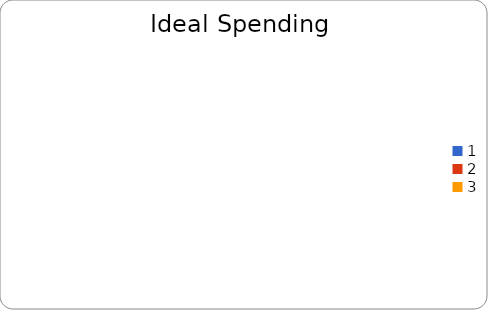
| Category | Series 0 |
|---|---|
| 0 | 50 |
| 1 | 30 |
| 2 | 20 |